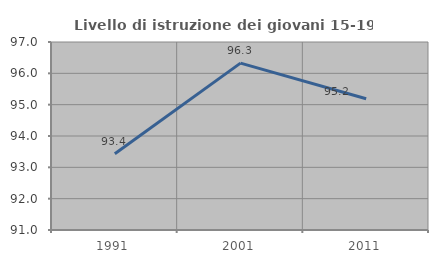
| Category | Livello di istruzione dei giovani 15-19 anni |
|---|---|
| 1991.0 | 93.433 |
| 2001.0 | 96.327 |
| 2011.0 | 95.187 |